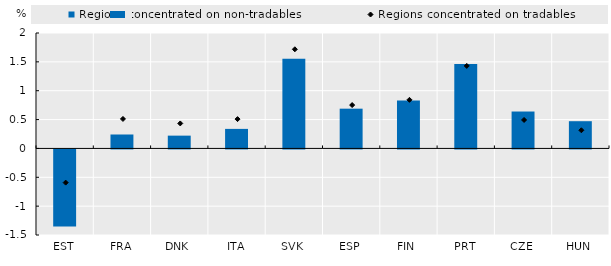
| Category | Regions concentrated on non-tradables |
|---|---|
| EST | -1.335 |
| FRA | 0.241 |
| DNK | 0.222 |
| ITA | 0.339 |
| SVK | 1.552 |
| ESP | 0.689 |
| FIN | 0.829 |
| PRT | 1.464 |
| CZE | 0.64 |
| HUN | 0.472 |